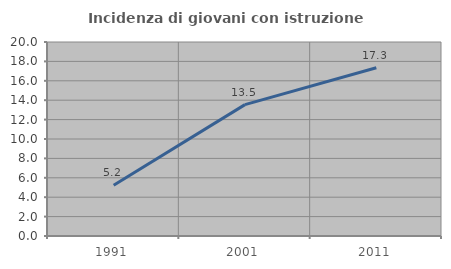
| Category | Incidenza di giovani con istruzione universitaria |
|---|---|
| 1991.0 | 5.229 |
| 2001.0 | 13.542 |
| 2011.0 | 17.347 |